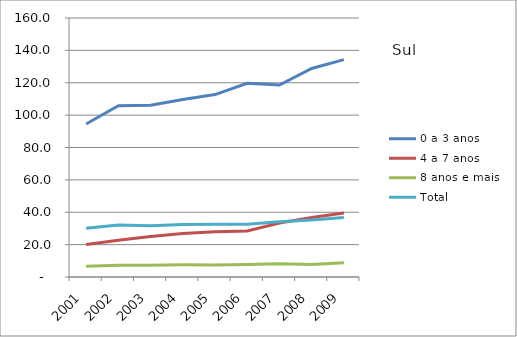
| Category | 0 a 3 anos | 4 a 7 anos | 8 anos e mais | Total |
|---|---|---|---|---|
| 2001.0 | 94.5 | 20.1 | 6.6 | 30.1 |
| 2002.0 | 105.8 | 22.7 | 7.3 | 32.1 |
| 2003.0 | 106.1 | 25 | 7.2 | 31.6 |
| 2004.0 | 109.7 | 26.9 | 7.5 | 32.5 |
| 2005.0 | 112.7 | 28 | 7.4 | 32.6 |
| 2006.0 | 119.7 | 28.4 | 7.7 | 32.6 |
| 2007.0 | 118.6 | 33.4 | 8.2 | 34.1 |
| 2008.0 | 128.8 | 36.7 | 7.7 | 35.2 |
| 2009.0 | 134.3 | 39.6 | 8.8 | 36.7 |